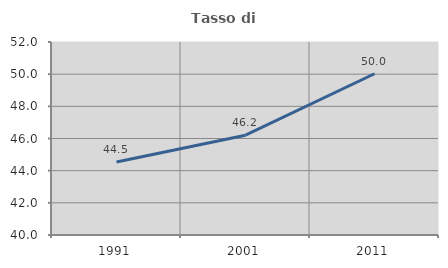
| Category | Tasso di occupazione   |
|---|---|
| 1991.0 | 44.535 |
| 2001.0 | 46.207 |
| 2011.0 | 50.025 |